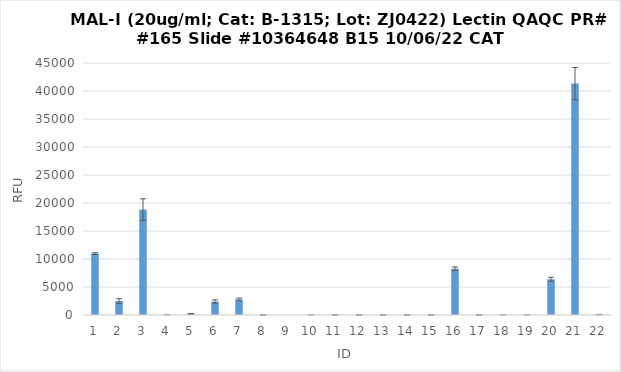
| Category | RFU |
|---|---|
| 0 | 10963.75 |
| 1 | 2492.5 |
| 2 | 18821 |
| 3 | 17.25 |
| 4 | 236 |
| 5 | 2408.25 |
| 6 | 2776.75 |
| 7 | -4 |
| 8 | -0.75 |
| 9 | 8.5 |
| 10 | 29 |
| 11 | -0.5 |
| 12 | -0.25 |
| 13 | 2.5 |
| 14 | 4 |
| 15 | 8278.5 |
| 16 | 6.25 |
| 17 | 6.75 |
| 18 | 1.75 |
| 19 | 6377 |
| 20 | 41317.25 |
| 21 | 85.75 |